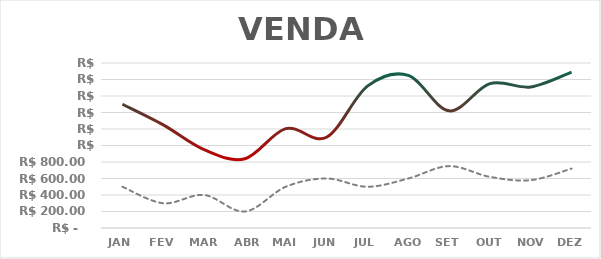
| Category | Series 0 | Series 1 |
|---|---|---|
| JAN | 1500 | 500 |
| FEV | 1250 | 300 |
| MAR | 950 | 400 |
| ABR | 840 | 200 |
| MAI | 1205 | 500 |
| JUN | 1100 | 600 |
| JUL | 1720 | 500 |
| AGO | 1850 | 600 |
| SET | 1420 | 750 |
| OUT | 1750 | 620 |
| NOV | 1710 | 580 |
| DEZ | 1890 | 720 |